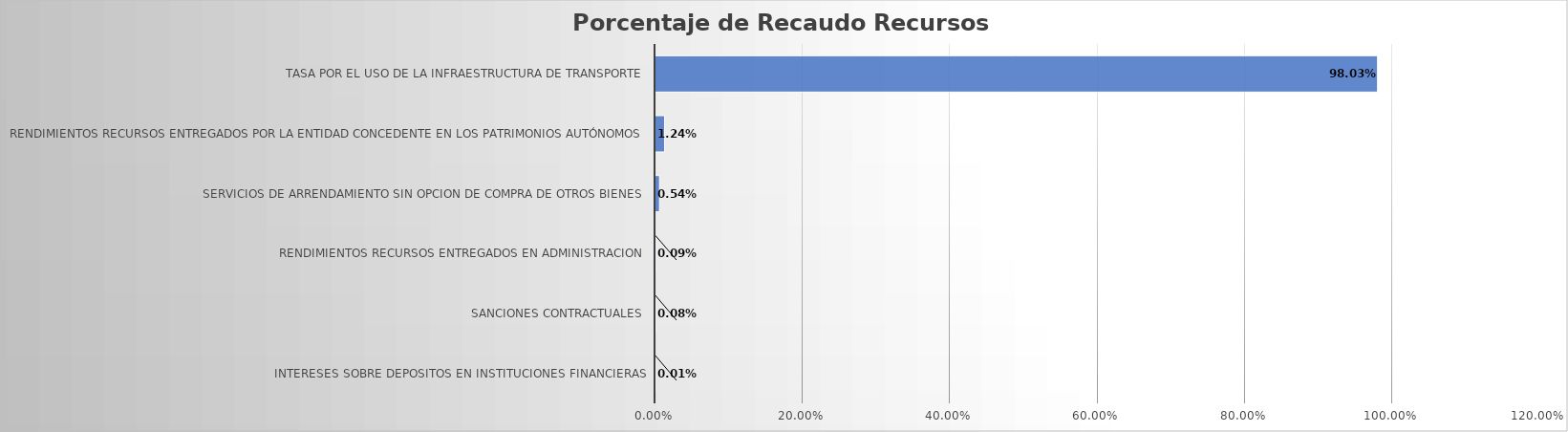
| Category | Total |
|---|---|
| INTERESES SOBRE DEPOSITOS EN INSTITUCIONES FINANCIERAS | 0 |
| SANCIONES CONTRACTUALES | 0.001 |
| RENDIMIENTOS RECURSOS ENTREGADOS EN ADMINISTRACION | 0.001 |
| SERVICIOS DE ARRENDAMIENTO SIN OPCION DE COMPRA DE OTROS BIENES | 0.005 |
| RENDIMIENTOS RECURSOS ENTREGADOS POR LA ENTIDAD CONCEDENTE EN LOS PATRIMONIOS AUTÓNOMOS | 0.012 |
| TASA POR EL USO DE LA INFRAESTRUCTURA DE TRANSPORTE | 0.98 |